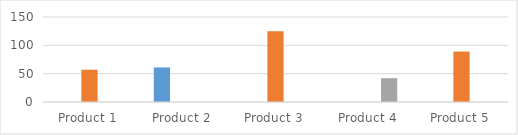
| Category | < $5000 | $5000 - $10000 | > $10000 |
|---|---|---|---|
| Product 1 | 0 | 57 | 0 |
| Product 2 | 61 | 0 | 0 |
| Product 3 | 0 | 125 | 0 |
| Product 4 | 0 | 0 | 42 |
| Product 5 | 0 | 89 | 0 |